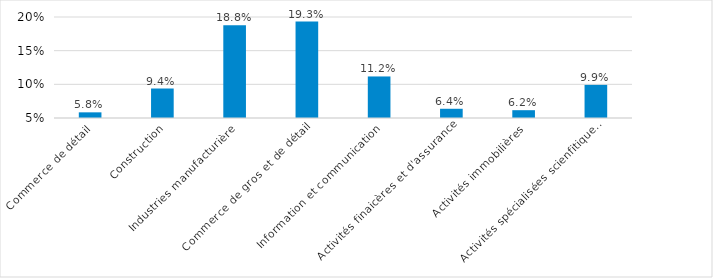
| Category | Series 0 |
|---|---|
| Commerce de détail | 0.058 |
| Construction | 0.094 |
| Industries manufacturière | 0.188 |
| Commerce de gros et de détail | 0.193 |
| Information et communication | 0.112 |
| Activités finaicères et d'assurance | 0.064 |
| Activités immobilières | 0.062 |
| Activités spécialisées scienfitiques et techniques | 0.099 |